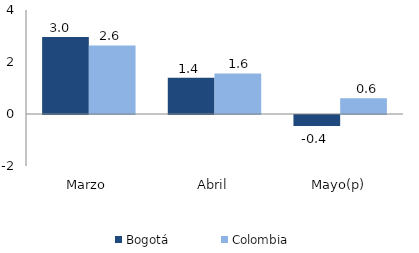
| Category | Bogotá | Colombia |
|---|---|---|
| Marzo | 2.962 | 2.639 |
| Abril | 1.391 | 1.561 |
| Mayo(p) | -0.423 | 0.609 |